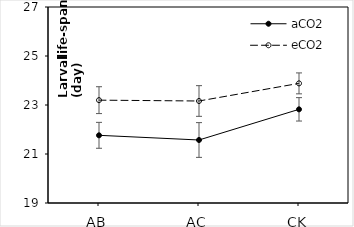
| Category | aCO2 | eCO2 |
|---|---|---|
| AB | 21.763 | 23.198 |
| AC | 21.572 | 23.163 |
| CK | 22.823 | 23.883 |